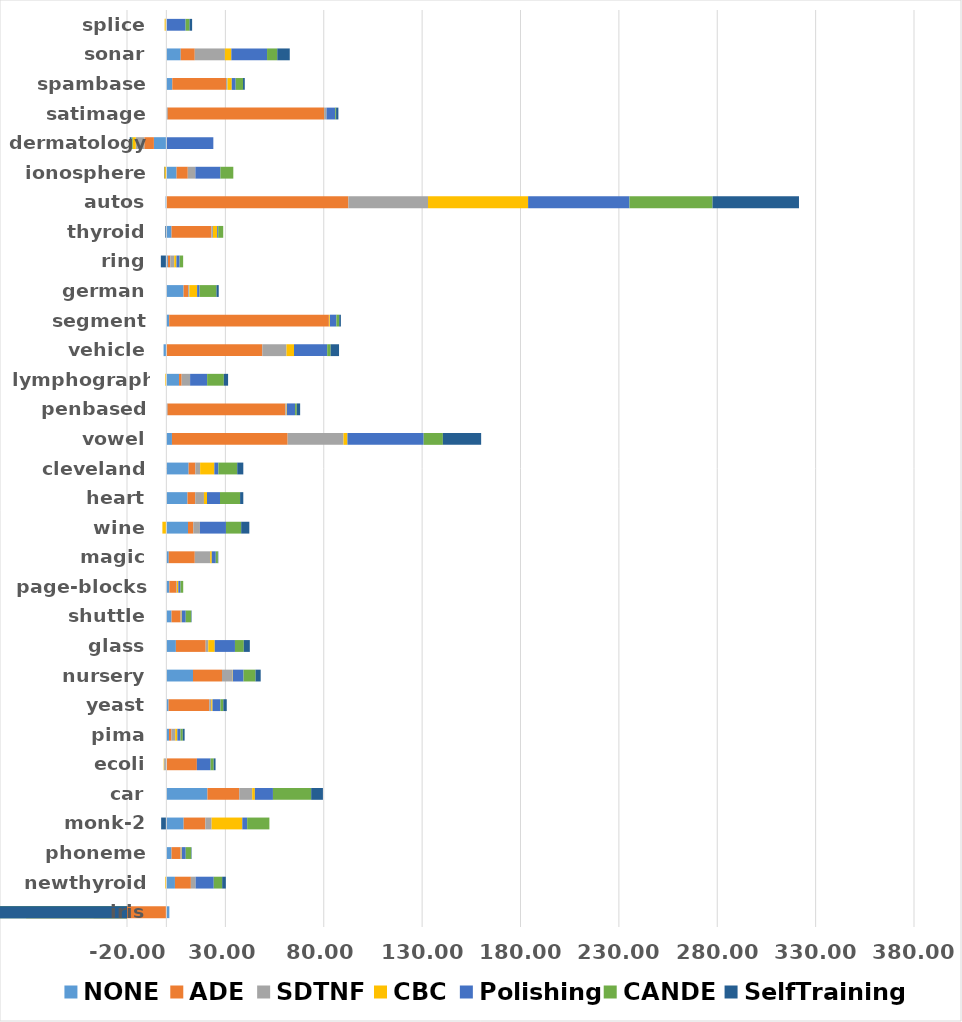
| Category | NONE | ADE | SDTNF | CBC | Polishing | CANDE | SelfTraining |
|---|---|---|---|---|---|---|---|
| iris | 1.528 | -36.967 | -34.3 | -38.433 | -32.967 | -37.767 | -36.433 |
| newthyroid | 4.372 | 8.093 | 2.419 | -0.558 | 9.209 | 4.279 | 1.86 |
| phoneme | 2.635 | 4.613 | 0.278 | 0.281 | 2.046 | 2.746 | 0.218 |
| monk-2 | 8.799 | 11.013 | 3.196 | 15.603 | 2.462 | 11.299 | -2.64 |
| car | 20.891 | 16.169 | 6.574 | 1.354 | 9.19 | 19.434 | 5.972 |
| ecoli | 0.061 | 15.455 | -1.127 | -0.236 | 6.975 | 1.554 | 0.96 |
| pima | 1.351 | 1.221 | 1.952 | 1.064 | 1.618 | 1.144 | 0.939 |
| yeast | 1.145 | 20.637 | 1.036 | 0.647 | 4.029 | 1.455 | 1.752 |
| nursery | 13.548 | 14.747 | 5.416 | 0.123 | 5.401 | 6.095 | 2.624 |
| glass | 4.85 | 15.141 | 1.318 | 3.274 | 10.288 | 4.481 | 3.079 |
| shuttle | 2.635 | 4.613 | 0.278 | 0.281 | 2.046 | 2.746 | 0.218 |
| page-blocks | 1.539 | 3.651 | 0.219 | 0.672 | 1.111 | 1.378 | -0.19 |
| magic | 1.236 | 13.215 | 7.821 | 0.822 | 2.028 | 1.077 | 0.198 |
| wine | 11.01 | 2.686 | 3.362 | -2.019 | 13.238 | 7.737 | 4.146 |
| heart | 10.741 | 3.926 | 4.444 | 1.556 | 6.593 | 10.222 | 1.63 |
| cleveland | 11.332 | 3.424 | 2.42 | 7.21 | 2.076 | 9.563 | 3.09 |
| vowel | 2.848 | 58.808 | 28.384 | 2 | 38.747 | 9.758 | 19.455 |
| penbased | 0.579 | 59.954 | 0.602 | 0.169 | 4.121 | 0.877 | 1.699 |
| lymphography | 6.451 | 1.32 | 4.303 | -0.533 | 8.653 | 8.478 | 2.175 |
| vehicle | -1.415 | 48.785 | 12.27 | 3.832 | 16.856 | 1.753 | 4.278 |
| segment | 1.437 | 81.169 | 0.182 | 0.372 | 3.264 | 1.429 | 0.857 |
| german | 8.74 | 2.34 | 0.6 | 3.96 | 1.24 | 8.58 | 1.16 |
| ring | 0.77 | 1.222 | 2.016 | 1.114 | 1.608 | 1.803 | -2.797 |
| thyroid | 2.636 | 20.258 | 0.811 | 2.131 | 0.514 | 2.553 | -0.558 |
| autos | -0.4 | 92.525 | 40.469 | 50.876 | 51.517 | 42.21 | 43.944 |
| ionosphere | 5.186 | 5.703 | 3.87 | -1.019 | 12.713 | 6.559 | -0.17 |
| dermatology | -6.332 | -4.871 | -4.322 | -1.57 | 23.883 | -0.639 | -0.904 |
| satimage | 0.625 | 79.562 | 1.225 | -0.037 | 4.416 | 0.448 | 1.166 |
| spambase | 3.024 | 27.325 | 0.757 | 2.136 | 2.001 | 3.729 | 0.892 |
| sonar | 7.305 | 7.138 | 15.315 | 3.266 | 18.156 | 5.194 | 6.348 |
| splice | -0.188 | 0 | -0.125 | -0.562 | 9.786 | 2 | 1.312 |